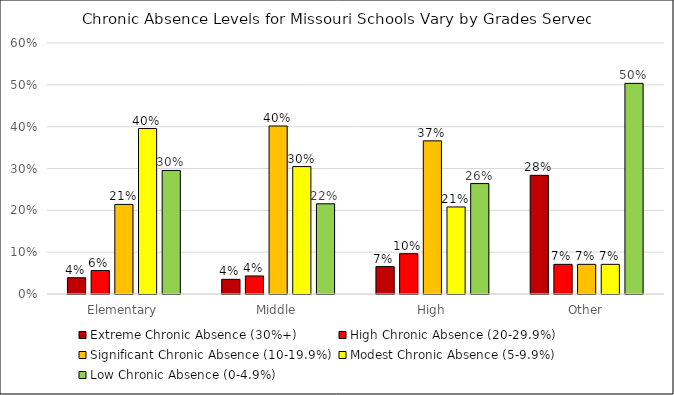
| Category | Extreme Chronic Absence (30%+) | High Chronic Absence (20-29.9%) | Significant Chronic Absence (10-19.9%) | Modest Chronic Absence (5-9.9%) | Low Chronic Absence (0-4.9%) |
|---|---|---|---|---|---|
| Elementary | 0.039 | 0.056 | 0.214 | 0.396 | 0.295 |
| Middle | 0.035 | 0.043 | 0.402 | 0.305 | 0.216 |
| High | 0.066 | 0.096 | 0.366 | 0.208 | 0.264 |
| Other | 0.284 | 0.071 | 0.071 | 0.071 | 0.504 |